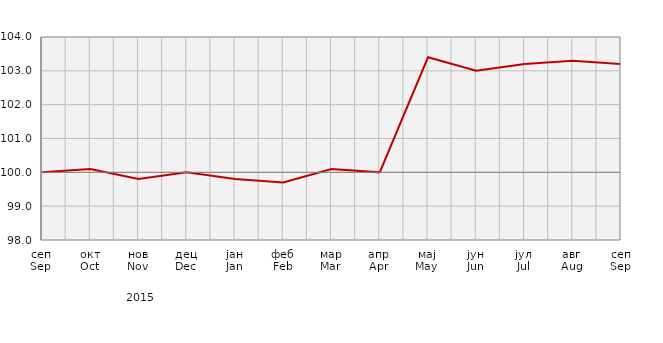
| Category | Индекси цијена произвођача
Producer price indices |
|---|---|
| сеп
Sep | 100 |
| окт
Oct | 100.1 |
| нов
Nov | 99.8 |
| дец
Dec | 100 |
| јан
Jan | 99.8 |
| феб
Feb | 99.7 |
| мар
Mar | 100.1 |
| апр
Apr | 100 |
| мај
May | 103.4 |
| јун
Jun | 103 |
| јул
Jul | 103.2 |
| авг
Aug | 103.3 |
| сеп
Sep | 103.2 |